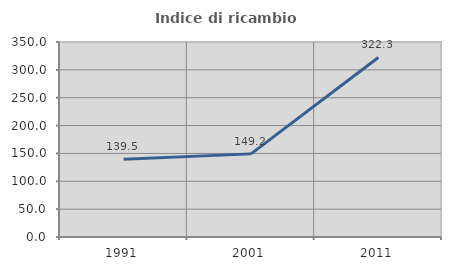
| Category | Indice di ricambio occupazionale  |
|---|---|
| 1991.0 | 139.51 |
| 2001.0 | 149.2 |
| 2011.0 | 322.293 |